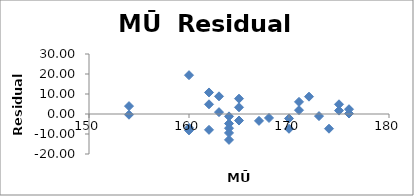
| Category | Series 0 |
|---|---|
| 165.0 | -3.264 |
| 154.0 | 3.939 |
| 171.0 | 1.906 |
| 174.0 | -7.356 |
| 173.0 | -1.04 |
| 170.0 | -2.229 |
| 175.0 | 1.71 |
| 164.0 | -7.096 |
| 171.0 | 6.063 |
| 162.0 | 4.859 |
| 172.0 | 8.668 |
| 165.0 | 3.362 |
| 168.0 | -1.979 |
| 176.0 | 2.385 |
| 162.0 | -7.915 |
| 160.0 | 19.414 |
| 175.0 | 4.867 |
| 154.0 | -0.365 |
| 170.0 | -7.386 |
| 160.0 | -8.204 |
| 160.0 | -6.978 |
| 165.0 | 7.666 |
| 164.0 | -12.939 |
| 164.0 | -4.782 |
| 162.0 | 10.772 |
| 163.0 | 8.838 |
| 176.0 | 0.237 |
| 164.0 | -1.174 |
| 167.0 | -3.436 |
| 163.0 | 0.925 |
| 164.0 | -9.469 |